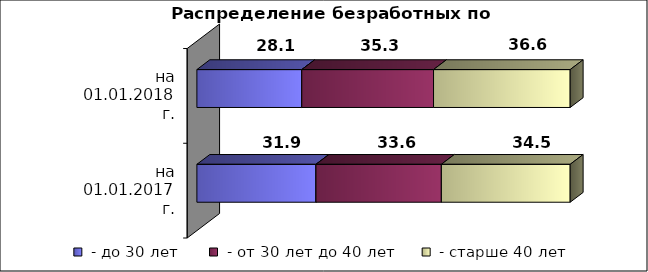
| Category |  - до 30 лет  |  - от 30 лет до 40 лет  |  - старше 40 лет  |
|---|---|---|---|
| на 01.01.2017 г. | 31.9 | 33.6 | 34.5 |
| на 01.01.2018 г. | 28.1 | 35.3 | 36.6 |